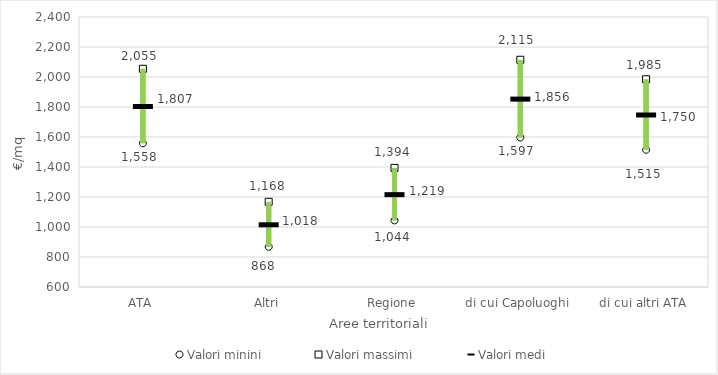
| Category | Valori minini | Valori massimi | Valori medi |
|---|---|---|---|
| ATA | 1558 | 2055 | 1806.5 |
| Altri | 868 | 1168 | 1018 |
| Regione | 1044 | 1394 | 1219 |
| di cui Capoluoghi | 1597 | 2115 | 1856 |
| di cui altri ATA | 1515 | 1985 | 1750 |